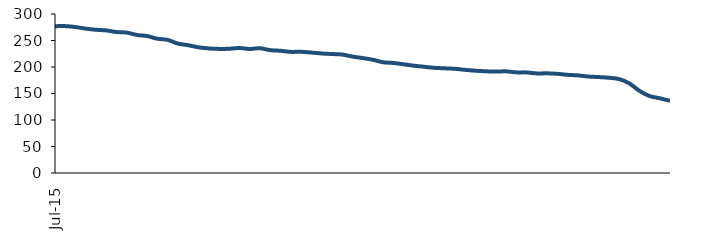
| Category | Series 0 |
|---|---|
| 2015-07-01 | 277.048 |
| 2015-08-01 | 277.107 |
| 2015-09-01 | 275.376 |
| 2015-10-01 | 272.342 |
| 2015-11-01 | 270.271 |
| 2015-12-01 | 269.029 |
| 2016-01-01 | 265.942 |
| 2016-02-01 | 264.894 |
| 2016-03-01 | 260.422 |
| 2016-04-01 | 258.328 |
| 2016-05-01 | 253.283 |
| 2016-06-01 | 251.138 |
| 2016-07-01 | 244.094 |
| 2016-08-01 | 241.049 |
| 2016-09-01 | 237.208 |
| 2016-10-01 | 235.027 |
| 2016-11-01 | 234.148 |
| 2016-12-01 | 234.409 |
| 2017-01-01 | 235.803 |
| 2017-02-01 | 233.971 |
| 2017-03-01 | 235.422 |
| 2017-04-01 | 231.793 |
| 2017-05-01 | 230.616 |
| 2017-06-01 | 228.548 |
| 2017-07-01 | 228.711 |
| 2017-08-01 | 227.276 |
| 2017-09-01 | 225.566 |
| 2017-10-01 | 224.469 |
| 2017-11-01 | 223.579 |
| 2017-12-01 | 219.752 |
| 2018-01-01 | 216.932 |
| 2018-02-01 | 213.718 |
| 2018-03-01 | 208.945 |
| 2018-04-01 | 207.658 |
| 2018-05-01 | 205.111 |
| 2018-06-01 | 202.506 |
| 2018-07-01 | 200.483 |
| 2018-08-01 | 198.424 |
| 2018-09-01 | 197.545 |
| 2018-10-01 | 196.615 |
| 2018-11-01 | 194.641 |
| 2018-12-01 | 193.019 |
| 2019-01-01 | 191.892 |
| 2019-02-01 | 191.304 |
| 2019-03-01 | 191.791 |
| 2019-04-01 | 189.89 |
| 2019-05-01 | 189.762 |
| 2019-06-01 | 187.874 |
| 2019-07-01 | 188.084 |
| 2019-08-01 | 187.109 |
| 2019-09-01 | 185.248 |
| 2019-10-01 | 184.195 |
| 2019-11-01 | 182.028 |
| 2019-12-01 | 181.044 |
| 2020-01-01 | 179.776 |
| 2020-02-01 | 177.328 |
| 2020-03-01 | 169.453 |
| 2020-04-01 | 155.277 |
| 2020-05-01 | 145.207 |
| 2020-06-01 | 141.034 |
| 2020-07-01 | 136.109 |